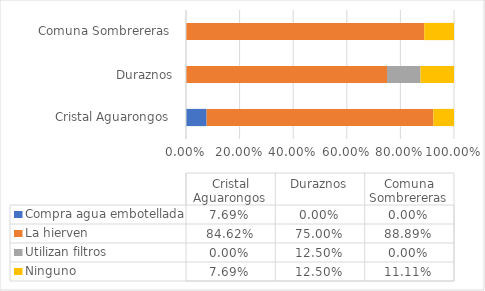
| Category | Compra agua embotellada | La hierven  | Utilizan filtros  | Ninguno |
|---|---|---|---|---|
| Cristal Aguarongos  | 0.077 | 0.846 | 0 | 0.077 |
| Duraznos | 0 | 0.75 | 0.125 | 0.125 |
| Comuna Sombrereras  | 0 | 0.889 | 0 | 0.111 |